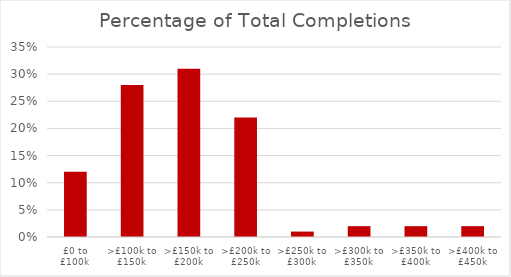
| Category | Percentage of Total Properties (%) |
|---|---|
| £0 to £100k | 0.12 |
| >£100k to £150k | 0.28 |
| >£150k to £200k | 0.31 |
| >£200k to £250k | 0.22 |
| >£250k to £300k | 0.01 |
| >£300k to £350k | 0.02 |
| >£350k to £400k | 0.02 |
| >£400k to £450k | 0.02 |